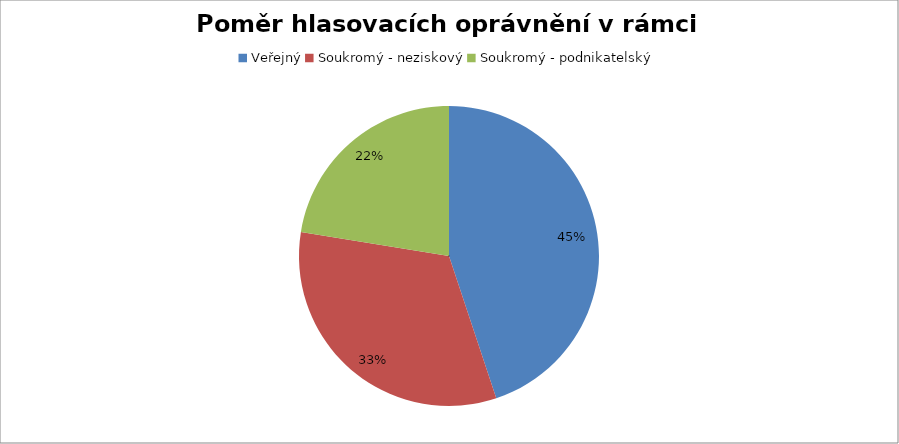
| Category | Series 0 |
|---|---|
| Veřejný | 0.449 |
| Soukromý - neziskový | 0.327 |
| Soukromý - podnikatelský | 0.224 |